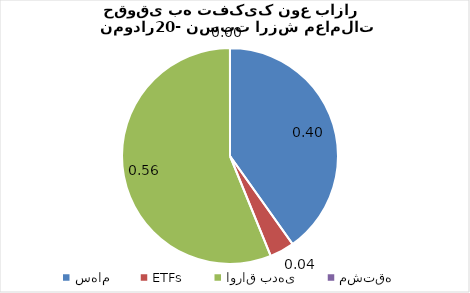
| Category | Series 0 |
|---|---|
| سهام | 0.402 |
| ETFs | 0.037 |
| اوراق بدهی | 0.562 |
| مشتقه | 0 |